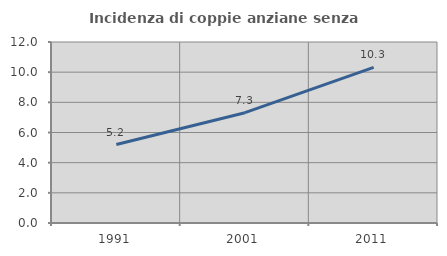
| Category | Incidenza di coppie anziane senza figli  |
|---|---|
| 1991.0 | 5.199 |
| 2001.0 | 7.313 |
| 2011.0 | 10.313 |